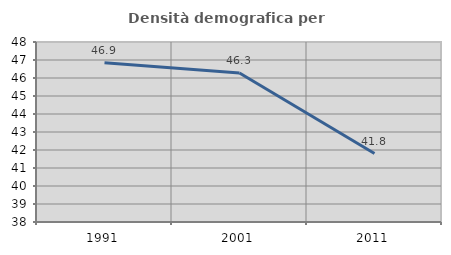
| Category | Densità demografica |
|---|---|
| 1991.0 | 46.852 |
| 2001.0 | 46.275 |
| 2011.0 | 41.805 |